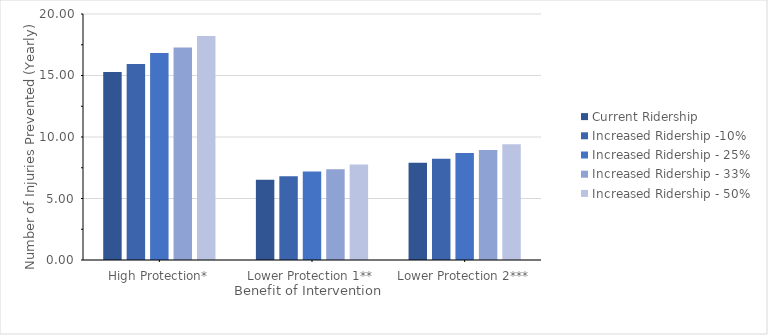
| Category | Current Ridership | Increased Ridership -10% | Increased Ridership - 25% | Increased Ridership - 33% | Increased Ridership - 50% |
|---|---|---|---|---|---|
| High Protection* | 15.29 | 15.93 | 16.83 | 17.285 | 18.202 |
| Lower Protection 1** | 6.528 | 6.801 | 7.186 | 7.38 | 7.772 |
| Lower Protection 2*** | 7.903 | 8.233 | 8.699 | 8.934 | 9.408 |